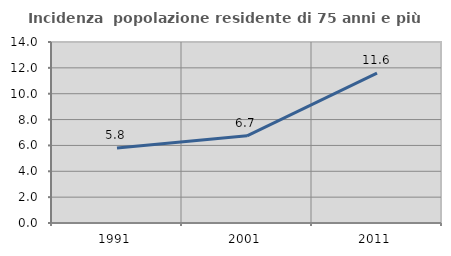
| Category | Incidenza  popolazione residente di 75 anni e più |
|---|---|
| 1991.0 | 5.798 |
| 2001.0 | 6.745 |
| 2011.0 | 11.589 |